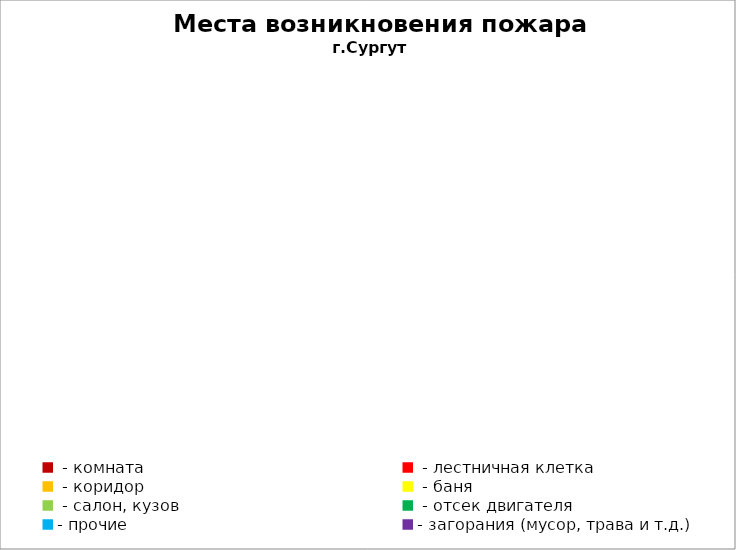
| Category | Места возникновения пожара |
|---|---|
|  - комната | 11 |
|  - лестничная клетка | 1 |
|  - коридор | 1 |
|  - баня | 2 |
|  - салон, кузов | 3 |
|  - отсек двигателя | 17 |
| - прочие | 51 |
| - загорания (мусор, трава и т.д.)  | 14 |